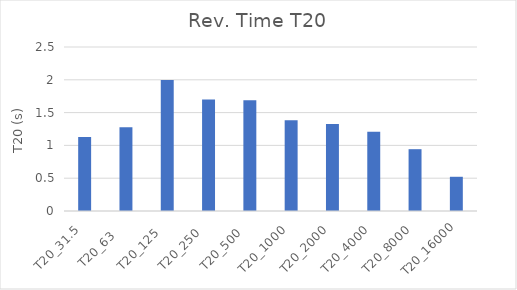
| Category | Series 0 |
|---|---|
| T20_31.5  | 1.128 |
| T20_63    | 1.275 |
| T20_125   | 1.996 |
| T20_250   | 1.698 |
| T20_500   | 1.688 |
| T20_1000  | 1.382 |
| T20_2000  | 1.326 |
| T20_4000  | 1.206 |
| T20_8000  | 0.942 |
| T20_16000 | 0.522 |